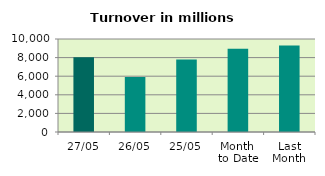
| Category | Series 0 |
|---|---|
| 27/05 | 8029.343 |
| 26/05 | 5911.065 |
| 25/05 | 7786.638 |
| Month 
to Date | 8950.994 |
| Last
Month | 9311.354 |